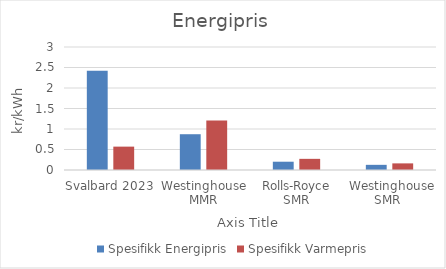
| Category | Spesifikk Energipris | Spesifikk Varmepris |
|---|---|---|
| Svalbard 2023 | 2.42 | 0.57 |
| Westinghouse MMR | 0.873 | 1.208 |
| Rolls-Royce SMR | 0.202 | 0.272 |
|  Westinghouse SMR  | 0.126 | 0.161 |